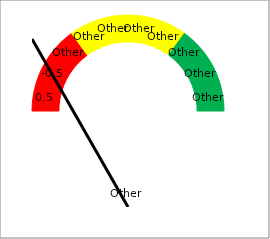
| Category | Series 0 |
|---|---|
| 10.0 | 0 |
| nan | 1 |
| 9.0 | 0 |
| nan | 1 |
| 8.0 | 0 |
| nan | 1 |
| 7.0 | 0 |
| nan | 1 |
| 6.0 | 0 |
| nan | 1 |
| 5.0 | 0 |
| nan | 1 |
| 4.0 | 0 |
| nan | 1 |
| 3.0 | 0 |
| nan | 1 |
| 2.0 | 0 |
| nan | 1 |
| 1.0 | 0 |
| nan | 1 |
| 0.0 | 0 |
| nan | 10 |